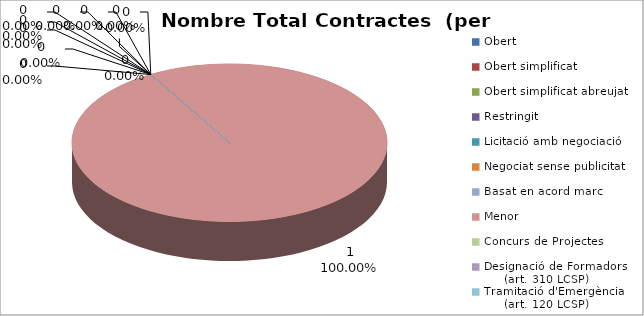
| Category | Nombre Total Contractes |
|---|---|
| Obert | 0 |
| Obert simplificat | 0 |
| Obert simplificat abreujat | 0 |
| Restringit | 0 |
| Licitació amb negociació | 0 |
| Negociat sense publicitat | 0 |
| Basat en acord marc | 0 |
| Menor | 1 |
| Concurs de Projectes | 0 |
| Designació de Formadors
     (art. 310 LCSP) | 0 |
| Tramitació d'Emergència
     (art. 120 LCSP) | 0 |